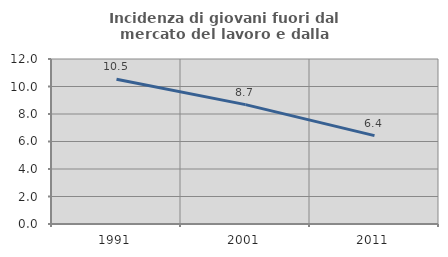
| Category | Incidenza di giovani fuori dal mercato del lavoro e dalla formazione  |
|---|---|
| 1991.0 | 10.526 |
| 2001.0 | 8.682 |
| 2011.0 | 6.429 |